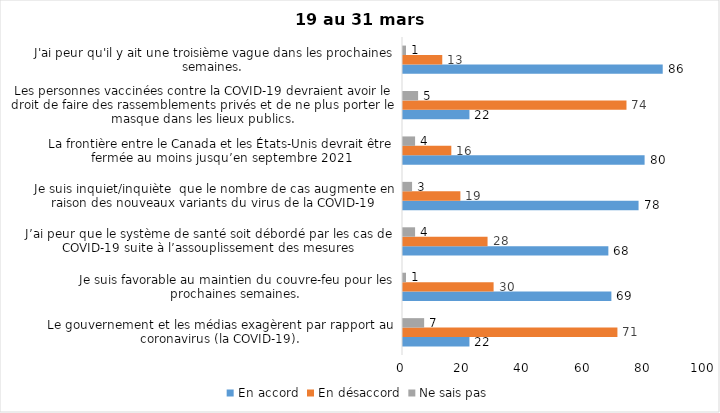
| Category | En accord | En désaccord | Ne sais pas |
|---|---|---|---|
| Le gouvernement et les médias exagèrent par rapport au coronavirus (la COVID-19). | 22 | 71 | 7 |
| Je suis favorable au maintien du couvre-feu pour les prochaines semaines. | 69 | 30 | 1 |
| J’ai peur que le système de santé soit débordé par les cas de COVID-19 suite à l’assouplissement des mesures | 68 | 28 | 4 |
| Je suis inquiet/inquiète  que le nombre de cas augmente en raison des nouveaux variants du virus de la COVID-19 | 78 | 19 | 3 |
| La frontière entre le Canada et les États-Unis devrait être fermée au moins jusqu’en septembre 2021 | 80 | 16 | 4 |
| Les personnes vaccinées contre la COVID-19 devraient avoir le droit de faire des rassemblements privés et de ne plus porter le masque dans les lieux publics. | 22 | 74 | 5 |
| J'ai peur qu'il y ait une troisième vague dans les prochaines semaines. | 86 | 13 | 1 |